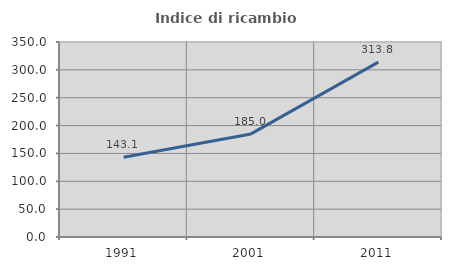
| Category | Indice di ricambio occupazionale  |
|---|---|
| 1991.0 | 143.085 |
| 2001.0 | 185 |
| 2011.0 | 313.793 |